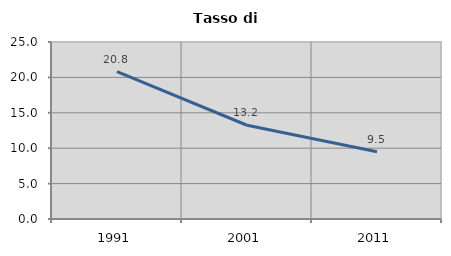
| Category | Tasso di disoccupazione   |
|---|---|
| 1991.0 | 20.803 |
| 2001.0 | 13.242 |
| 2011.0 | 9.492 |